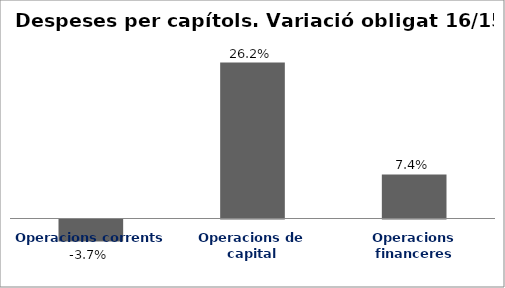
| Category | Series 0 |
|---|---|
| Operacions corrents | -0.037 |
| Operacions de capital | 0.262 |
| Operacions financeres | 0.074 |